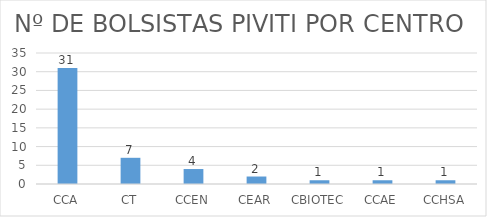
| Category | QTD |
|---|---|
| CCA | 31 |
| CT | 7 |
| CCEN | 4 |
| CEAR | 2 |
| CBIOTEC | 1 |
| CCAE | 1 |
| CCHSA | 1 |